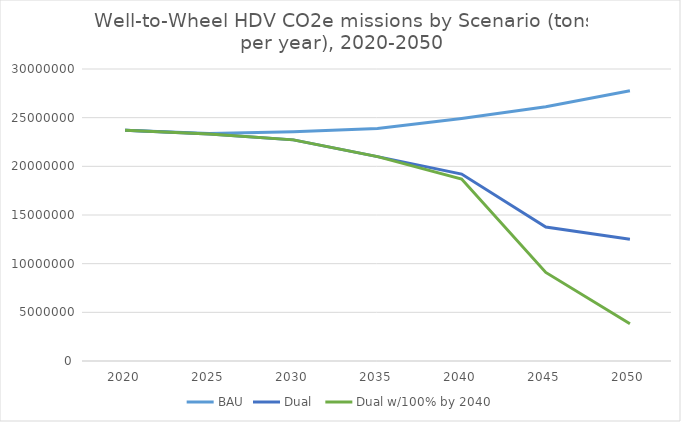
| Category | BAU | Dual  | Dual w/100% by 2040 |
|---|---|---|---|
| 2020.0 | 23715675.587 | 23715675.587 | 23715675.587 |
| 2025.0 | 23370675.642 | 23313701.996 | 23313701.996 |
| 2030.0 | 23563861.529 | 22718434.102 | 22718434.102 |
| 2035.0 | 23879779.868 | 20999419.4 | 20999419.4 |
| 2040.0 | 24924134.106 | 19202299.173 | 18699310.755 |
| 2045.0 | 26129606.844 | 13756071.361 | 9102164.065 |
| 2050.0 | 27759421.593 | 12517108.493 | 3825576.522 |